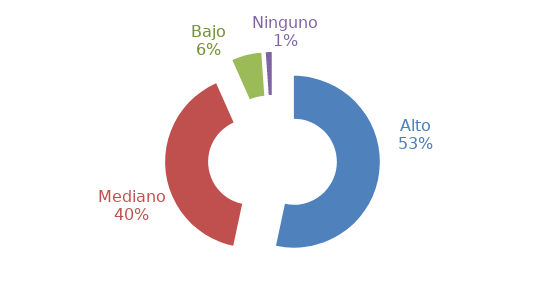
| Category | Series 0 |
|---|---|
| Alto | 0.533 |
| Mediano | 0.4 |
| Bajo | 0.056 |
| Ninguno | 0.011 |